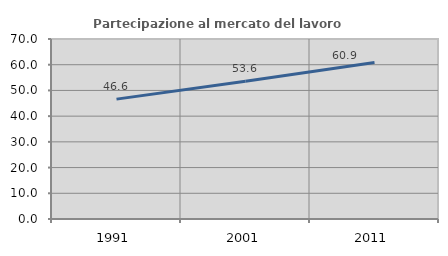
| Category | Partecipazione al mercato del lavoro  femminile |
|---|---|
| 1991.0 | 46.615 |
| 2001.0 | 53.584 |
| 2011.0 | 60.863 |